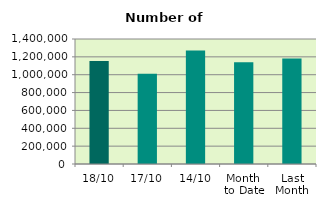
| Category | Series 0 |
|---|---|
| 18/10 | 1153834 |
| 17/10 | 1009894 |
| 14/10 | 1271772 |
| Month 
to Date | 1140634.667 |
| Last
Month | 1182612.273 |